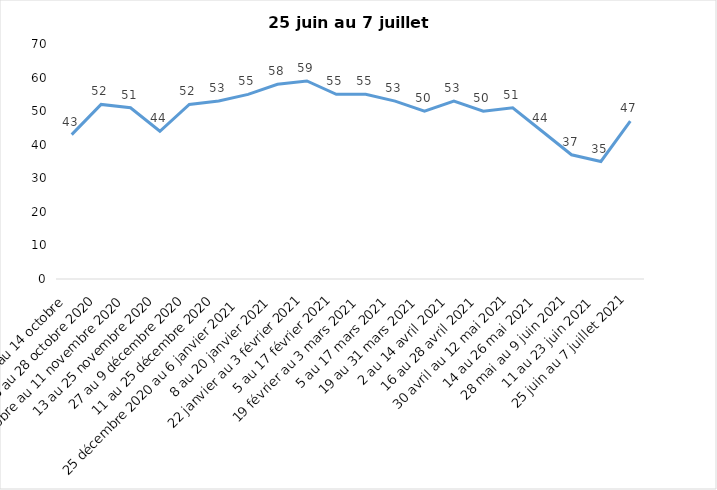
| Category | Toujours aux trois mesures |
|---|---|
| 2 au 14 octobre  | 43 |
| 16 au 28 octobre 2020 | 52 |
| 30 octobre au 11 novembre 2020 | 51 |
| 13 au 25 novembre 2020 | 44 |
| 27 au 9 décembre 2020 | 52 |
| 11 au 25 décembre 2020 | 53 |
| 25 décembre 2020 au 6 janvier 2021 | 55 |
| 8 au 20 janvier 2021 | 58 |
| 22 janvier au 3 février 2021 | 59 |
| 5 au 17 février 2021 | 55 |
| 19 février au 3 mars 2021 | 55 |
| 5 au 17 mars 2021 | 53 |
| 19 au 31 mars 2021 | 50 |
| 2 au 14 avril 2021 | 53 |
| 16 au 28 avril 2021 | 50 |
| 30 avril au 12 mai 2021 | 51 |
| 14 au 26 mai 2021 | 44 |
| 28 mai au 9 juin 2021 | 37 |
| 11 au 23 juin 2021 | 35 |
| 25 juin au 7 juillet 2021 | 47 |